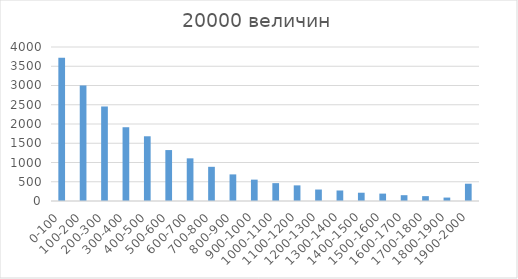
| Category | Series 0 |
|---|---|
| 0-100 | 3719 |
| 100-200 | 3001 |
| 200-300 | 2455 |
| 300-400 | 1916 |
| 400-500 | 1681 |
| 500-600 | 1323 |
| 600-700 | 1108 |
| 700-800 | 888 |
| 800-900 | 691 |
| 900-1000 | 555 |
| 1000-1100 | 464 |
| 1100-1200 | 406 |
| 1200-1300 | 298 |
| 1300-1400 | 273 |
| 1400-1500 | 215 |
| 1500-1600 | 192 |
| 1600-1700 | 151 |
| 1700-1800 | 126 |
| 1800-1900 | 89 |
| 1900-2000 | 449 |